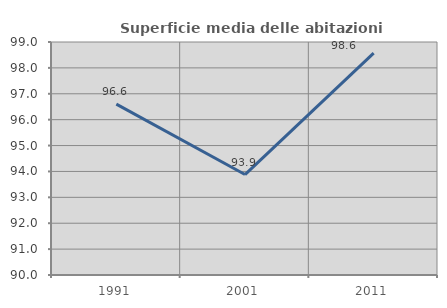
| Category | Superficie media delle abitazioni occupate |
|---|---|
| 1991.0 | 96.6 |
| 2001.0 | 93.88 |
| 2011.0 | 98.569 |